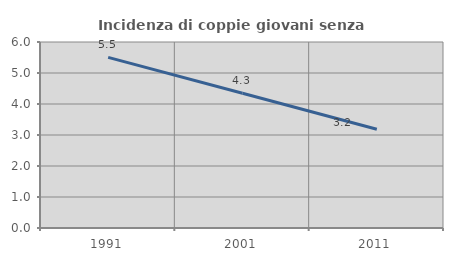
| Category | Incidenza di coppie giovani senza figli |
|---|---|
| 1991.0 | 5.505 |
| 2001.0 | 4.346 |
| 2011.0 | 3.187 |